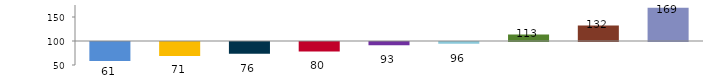
| Category | Series 0 |
|---|---|
|  | 60.563 |
|  | 70.667 |
|  | 75.758 |
|  | 80.435 |
|  | 93.392 |
|  | 96.46 |
|  | 113.483 |
|  | 132.258 |
|  | 169.444 |